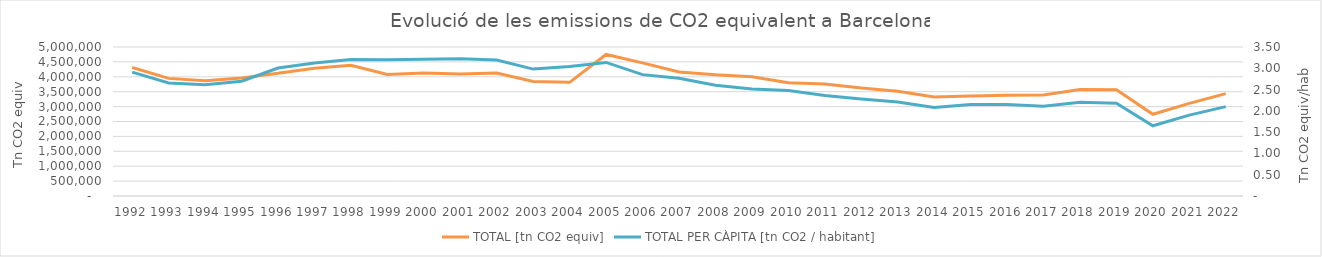
| Category | TOTAL [tn CO2 equiv] |
|---|---|
| 1992.0 | 4313002.656 |
| 1993.0 | 3946958.096 |
| 1994.0 | 3871592.383 |
| 1995.0 | 3957612.851 |
| 1996.0 | 4122822.866 |
| 1997.0 | 4286764.84 |
| 1998.0 | 4388835.954 |
| 1999.0 | 4077828.727 |
| 2000.0 | 4124276.87 |
| 2001.0 | 4095728.644 |
| 2002.0 | 4124103.461 |
| 2003.0 | 3844235.982 |
| 2004.0 | 3813979.479 |
| 2005.0 | 4750458.626 |
| 2006.0 | 4466791.612 |
| 2007.0 | 4162515.182 |
| 2008.0 | 4069539.023 |
| 2009.0 | 4005146.728 |
| 2010.0 | 3804295.098 |
| 2011.0 | 3760884.875 |
| 2012.0 | 3623187.529 |
| 2013.0 | 3512066.58 |
| 2014.0 | 3324422.467 |
| 2015.0 | 3358455.575 |
| 2016.0 | 3378868.097 |
| 2017.0 | 3391672.659 |
| 2018.0 | 3571586.519 |
| 2019.0 | 3566016.811 |
| 2020.0 | 2741711 |
| 2021.0 | 3108813 |
| 2022.0 | 3436597 |